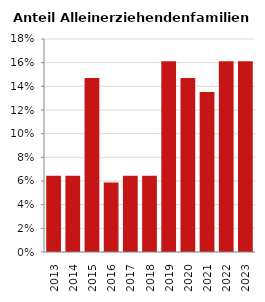
| Category | Anteil Alleinerziehende an Familien |
|---|---|
| 2013.0 | 0.065 |
| 2014.0 | 0.065 |
| 2015.0 | 0.147 |
| 2016.0 | 0.059 |
| 2017.0 | 0.065 |
| 2018.0 | 0.065 |
| 2019.0 | 0.161 |
| 2020.0 | 0.147 |
| 2021.0 | 0.135 |
| 2022.0 | 0.161 |
| 2023.0 | 0.161 |